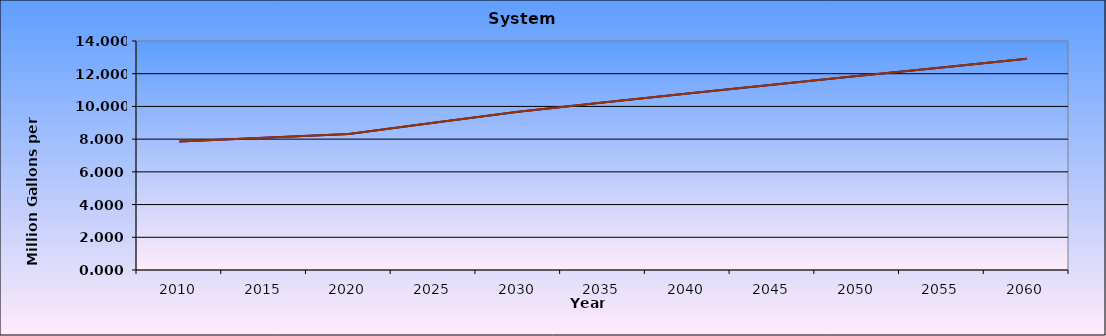
| Category | Series 0 | Series 1 |
|---|---|---|
| 2010.0 | 7.86 | 7.86 |
| 2015.0 | 8.09 | 8.09 |
| 2020.0 | 8.32 | 8.32 |
| 2025.0 | 9 | 9 |
| 2030.0 | 9.68 | 9.68 |
| 2035.0 | 10.235 | 10.235 |
| 2040.0 | 10.79 | 10.79 |
| 2045.0 | 11.325 | 11.325 |
| 2050.0 | 11.86 | 11.86 |
| 2055.0 | 12.385 | 12.385 |
| 2060.0 | 12.91 | 12.91 |